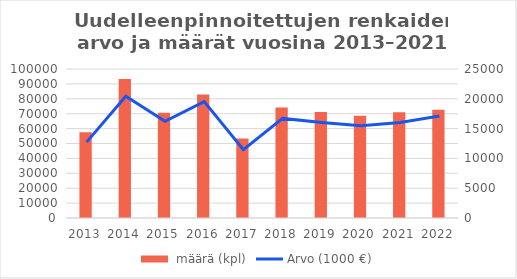
| Category |  määrä (kpl) |
|---|---|
| 2013.0 | 57597 |
| 2014.0 | 93216 |
| 2015.0 | 70596 |
| 2016.0 | 82804 |
| 2017.0 | 53359 |
| 2018.0 | 74087 |
| 2019.0 | 71156 |
| 2020.0 | 68541 |
| 2021.0 | 71034 |
| 2022.0 | 72617 |